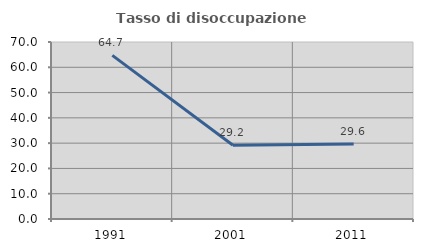
| Category | Tasso di disoccupazione giovanile  |
|---|---|
| 1991.0 | 64.706 |
| 2001.0 | 29.167 |
| 2011.0 | 29.63 |